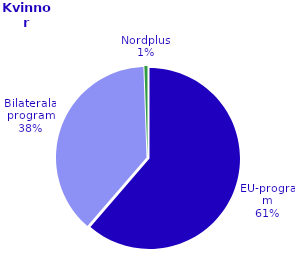
| Category | Series 0 |
|---|---|
| EU-program | 2668 |
| Bilaterala program | 1659 |
| Nordplus | 24 |